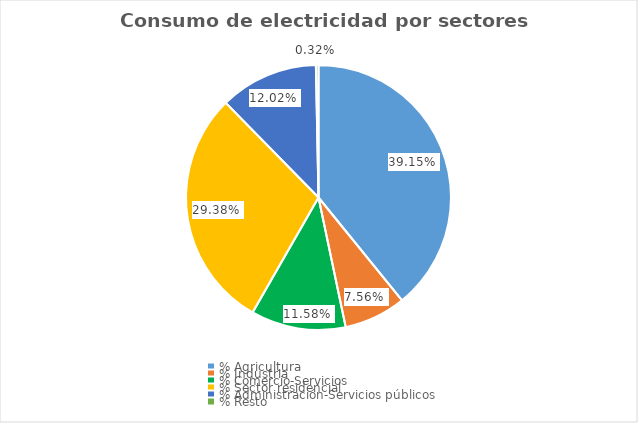
| Category | Series 0 |
|---|---|
| % Agricultura | 0.391 |
| % Industria | 0.076 |
| % Comercio-Servicios | 0.116 |
| % Sector residencial | 0.294 |
| % Administración-Servicios públicos | 0.12 |
| % Resto | 0.003 |